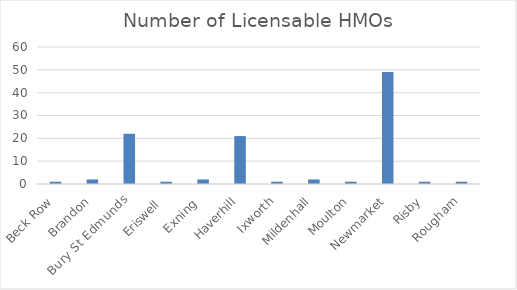
| Category | Number of Licensable HMOs |
|---|---|
| Beck Row | 1 |
| Brandon | 2 |
| Bury St Edmunds | 22 |
| Eriswell  | 1 |
| Exning  | 2 |
| Haverhill | 21 |
| Ixworth | 1 |
| Mildenhall | 2 |
| Moulton | 1 |
| Newmarket | 49 |
| Risby | 1 |
| Rougham | 1 |